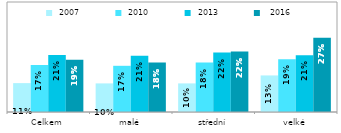
| Category |  2007 |  2010 |  2013 |   2016 |
|---|---|---|---|---|
| Celkem | 0.105 | 0.171 | 0.207 | 0.19 |
| malé | 0.104 | 0.168 | 0.205 | 0.18 |
| střední | 0.104 | 0.18 | 0.216 | 0.22 |
| velké | 0.133 | 0.192 | 0.206 | 0.27 |